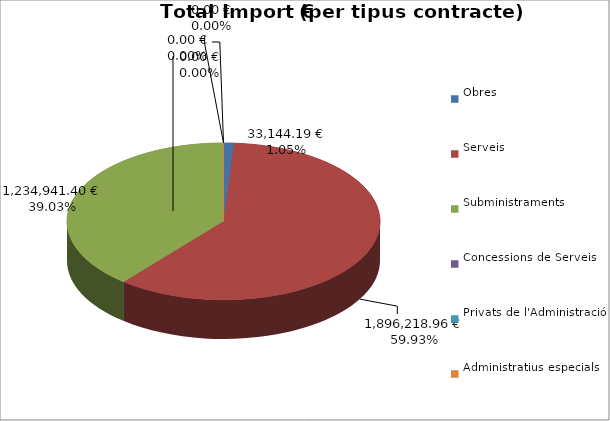
| Category | Total preu
(amb IVA) |
|---|---|
| Obres | 33144.19 |
| Serveis | 1896218.96 |
| Subministraments | 1234941.396 |
| Concessions de Serveis | 0 |
| Privats de l'Administració | 0 |
| Administratius especials | 0 |